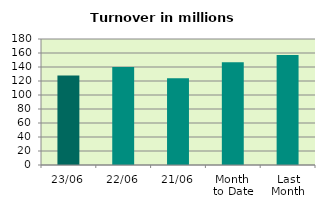
| Category | Series 0 |
|---|---|
| 23/06 | 127.849 |
| 22/06 | 140.164 |
| 21/06 | 123.902 |
| Month 
to Date | 146.613 |
| Last
Month | 157.265 |